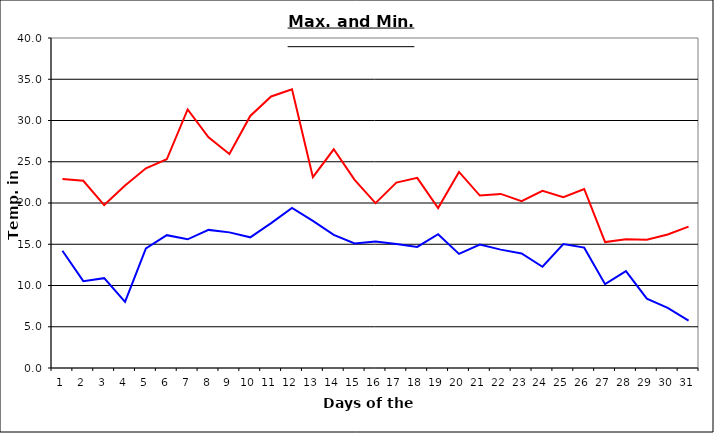
| Category | Series 0 | Series 1 |
|---|---|---|
| 0 | 22.9 | 14.21 |
| 1 | 22.69 | 10.53 |
| 2 | 19.75 | 10.89 |
| 3 | 22.13 | 8.01 |
| 4 | 24.2 | 14.5 |
| 5 | 25.3 | 16.1 |
| 6 | 31.34 | 15.6 |
| 7 | 27.97 | 16.74 |
| 8 | 25.95 | 16.44 |
| 9 | 30.55 | 15.84 |
| 10 | 32.91 | 17.56 |
| 11 | 33.79 | 19.41 |
| 12 | 23.13 | 17.84 |
| 13 | 26.51 | 16.14 |
| 14 | 22.81 | 15.09 |
| 15 | 19.98 | 15.32 |
| 16 | 22.47 | 15.02 |
| 17 | 23.05 | 14.68 |
| 18 | 19.387 | 16.21 |
| 19 | 23.77 | 13.83 |
| 20 | 20.9 | 14.96 |
| 21 | 21.1 | 14.35 |
| 22 | 20.22 | 13.89 |
| 23 | 21.47 | 12.27 |
| 24 | 20.71 | 15.02 |
| 25 | 21.7 | 14.59 |
| 26 | 15.26 | 10.16 |
| 27 | 15.62 | 11.74 |
| 28 | 15.54 | 8.4 |
| 29 | 16.19 | 7.28 |
| 30 | 17.14 | 5.75 |